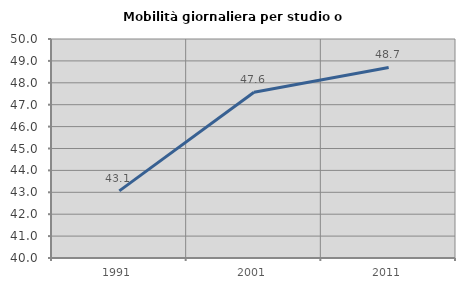
| Category | Mobilità giornaliera per studio o lavoro |
|---|---|
| 1991.0 | 43.064 |
| 2001.0 | 47.565 |
| 2011.0 | 48.702 |